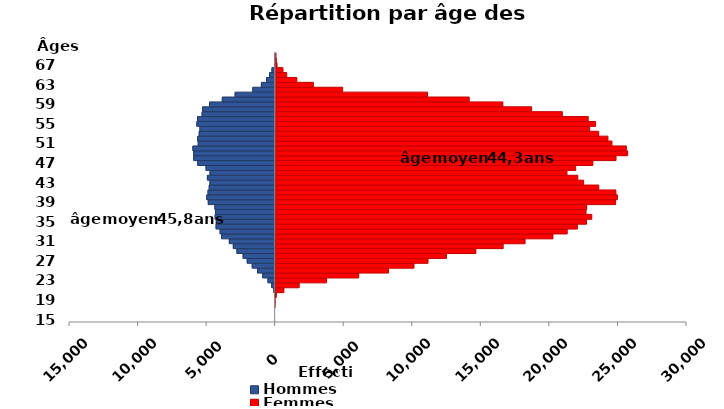
| Category | âge  | Hommes | Femmes |
|---|---|---|---|
| 15.0 | 15 | 0 | 0 |
| 16.0 | 16 | 0 | 0 |
| 17.0 | 17 | 0 | 0 |
| 18.0 | 18 | 0 | 1 |
| 19.0 | 19 | 0 | 7 |
| 20.0 | 20 | -19 | 99 |
| 21.0 | 21 | -99 | 652 |
| 22.0 | 22 | -250 | 1766 |
| 23.0 | 23 | -525 | 3764 |
| 24.0 | 24 | -914 | 6108 |
| 25.0 | 25 | -1290 | 8279 |
| 26.0 | 26 | -1673 | 10136 |
| 27.0 | 27 | -2038 | 11158 |
| 28.0 | 28 | -2338 | 12501 |
| 29.0 | 29 | -2791 | 14645 |
| 30.0 | 30 | -3052 | 16635 |
| 31.0 | 31 | -3342 | 18231 |
| 32.0 | 32 | -3907 | 20265 |
| 33.0 | 33 | -4013 | 21302 |
| 34.0 | 34 | -4309 | 22045 |
| 35.0 | 35 | -4294 | 22710 |
| 36.0 | 36 | -4376 | 23094 |
| 37.0 | 37 | -4342 | 22672 |
| 38.0 | 38 | -4394 | 22720 |
| 39.0 | 39 | -4879 | 24828 |
| 40.0 | 40 | -4989 | 24959 |
| 41.0 | 41 | -4894 | 24844 |
| 42.0 | 42 | -4809 | 23596 |
| 43.0 | 43 | -4754 | 22491 |
| 44.0 | 44 | -4943 | 22063 |
| 45.0 | 45 | -4752 | 21273 |
| 46.0 | 46 | -5042 | 21907 |
| 47.0 | 47 | -5646 | 23159 |
| 48.0 | 48 | -5939 | 24850 |
| 49.0 | 49 | -5950 | 25696 |
| 50.0 | 50 | -6001 | 25599 |
| 51.0 | 51 | -5611 | 24549 |
| 52.0 | 52 | -5653 | 24253 |
| 53.0 | 53 | -5538 | 23581 |
| 54.0 | 54 | -5488 | 22925 |
| 55.0 | 55 | -5711 | 23352 |
| 56.0 | 56 | -5663 | 22811 |
| 57.0 | 57 | -5327 | 20930 |
| 58.0 | 58 | -5288 | 18685 |
| 59.0 | 59 | -4786 | 16586 |
| 60.0 | 60 | -3854 | 14130 |
| 61.0 | 61 | -2920 | 11090 |
| 62.0 | 62 | -1631 | 4898 |
| 63.0 | 63 | -1005 | 2760 |
| 64.0 | 64 | -633 | 1554 |
| 65.0 | 65 | -413 | 814 |
| 66.0 | 66 | -234 | 540 |
| 67.0 | 67 | -38 | 106 |
| 68.0 | 68 | -18 | 37 |
| 69.0 | 69 | -2 | 19 |